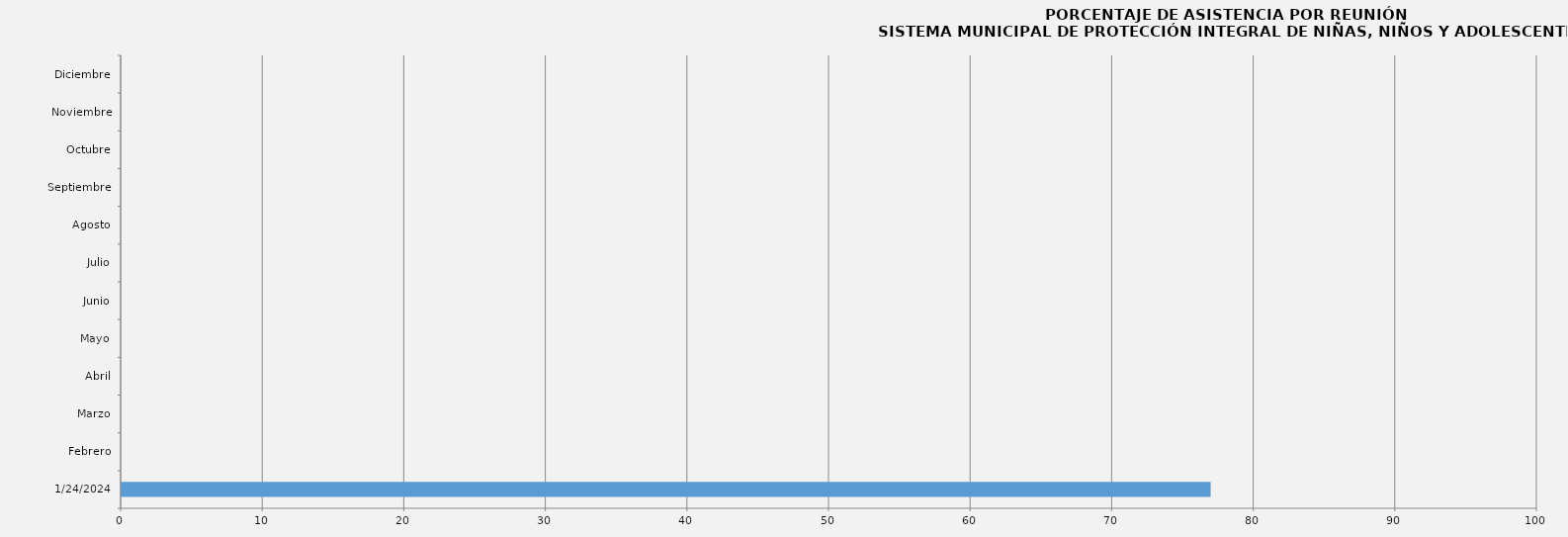
| Category | 24/01/2024 |
|---|---|
| 24/01/2024 | 76.923 |
| Febrero | 0 |
| Marzo | 0 |
| Abril | 0 |
| Mayo | 0 |
| Junio | 0 |
| Julio | 0 |
| Agosto | 0 |
| Septiembre | 0 |
| Octubre | 0 |
| Noviembre | 0 |
| Diciembre | 0 |